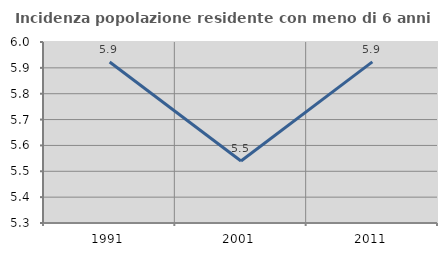
| Category | Incidenza popolazione residente con meno di 6 anni |
|---|---|
| 1991.0 | 5.923 |
| 2001.0 | 5.54 |
| 2011.0 | 5.923 |